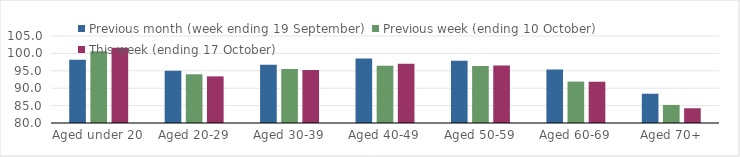
| Category | Previous month (week ending 19 September) | Previous week (ending 10 October) | This week (ending 17 October) |
|---|---|---|---|
| Aged under 20 | 98.14 | 100.62 | 101.65 |
| Aged 20-29 | 94.99 | 94 | 93.4 |
| Aged 30-39 | 96.71 | 95.51 | 95.23 |
| Aged 40-49 | 98.53 | 96.46 | 97.06 |
| Aged 50-59 | 97.92 | 96.37 | 96.54 |
| Aged 60-69 | 95.39 | 91.9 | 91.86 |
| Aged 70+ | 88.41 | 85.2 | 84.24 |